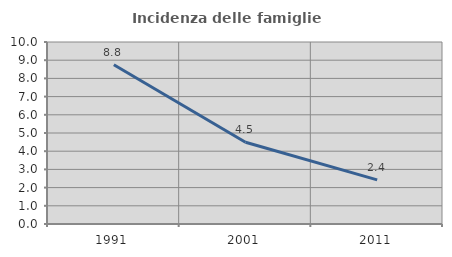
| Category | Incidenza delle famiglie numerose |
|---|---|
| 1991.0 | 8.75 |
| 2001.0 | 4.489 |
| 2011.0 | 2.421 |